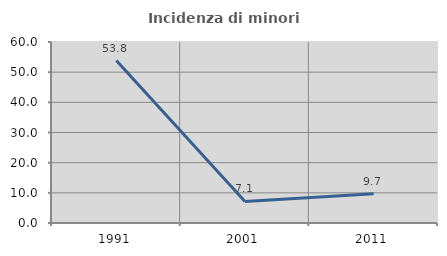
| Category | Incidenza di minori stranieri |
|---|---|
| 1991.0 | 53.846 |
| 2001.0 | 7.143 |
| 2011.0 | 9.677 |